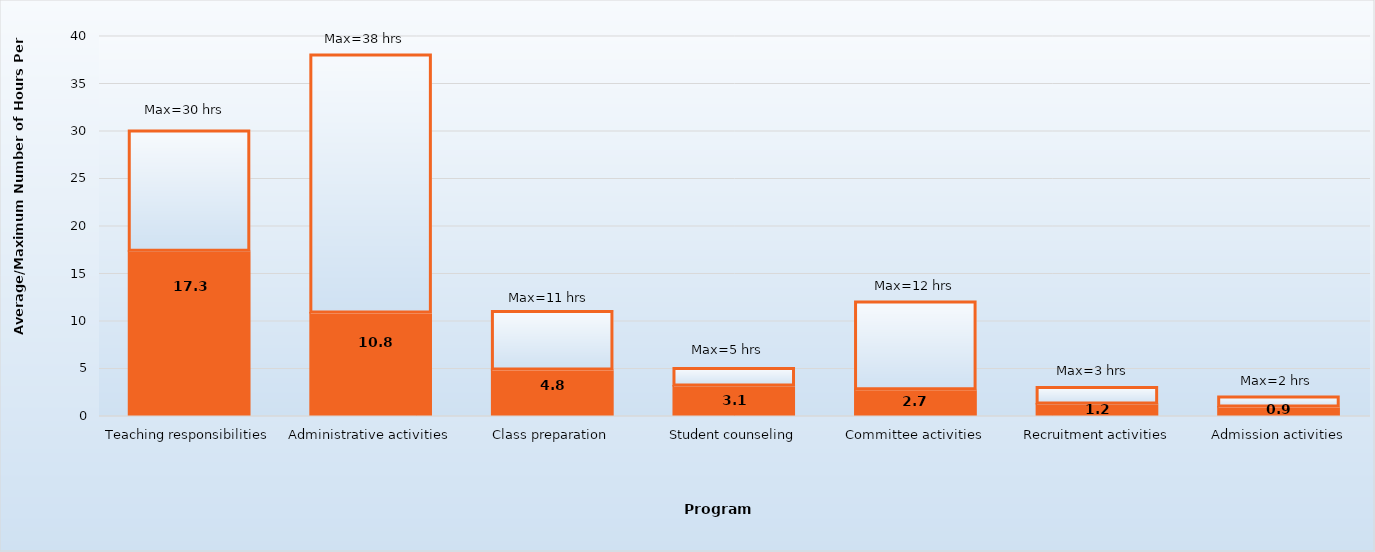
| Category | Average hours per week | Maximum |
|---|---|---|
| Teaching responsibilities | 17.3 | 12.7 |
| Administrative activities | 10.8 | 27.2 |
| Class preparation | 4.8 | 6.2 |
| Student counseling | 3.1 | 1.9 |
| Committee activities | 2.7 | 9.3 |
| Recruitment activities | 1.2 | 1.8 |
| Admission activities | 0.9 | 1.1 |